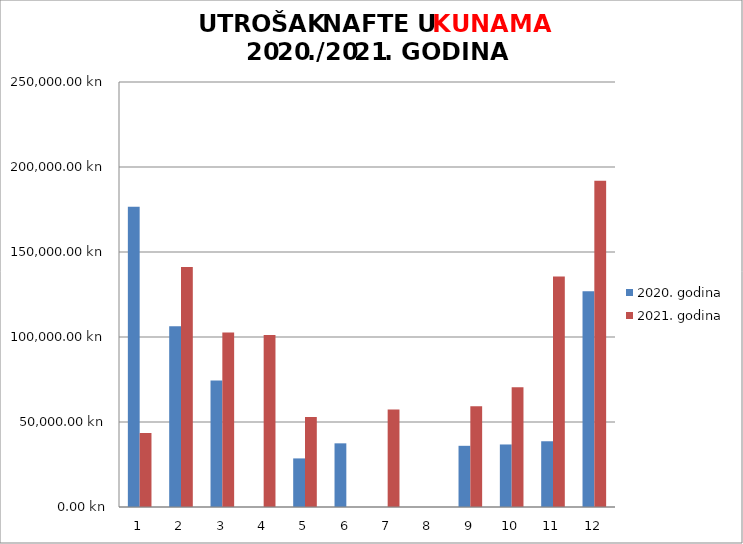
| Category | 2020. godina | 2021. godina |
|---|---|---|
| 0 | 176644 | 43590 |
| 1 | 106331.39 | 141167.53 |
| 2 | 74400.3 | 102629.93 |
| 3 | 0 | 101121.11 |
| 4 | 28579.76 | 52898.83 |
| 5 | 37451.89 | 0 |
| 6 | 0 | 57394.13 |
| 7 | 0 | 0 |
| 8 | 35991 | 59239.94 |
| 9 | 36783.06 | 70385.86 |
| 10 | 38673.23 | 135585 |
| 11 | 126875.55 | 191862 |